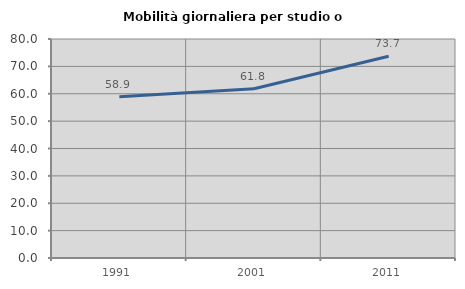
| Category | Mobilità giornaliera per studio o lavoro |
|---|---|
| 1991.0 | 58.879 |
| 2001.0 | 61.842 |
| 2011.0 | 73.684 |